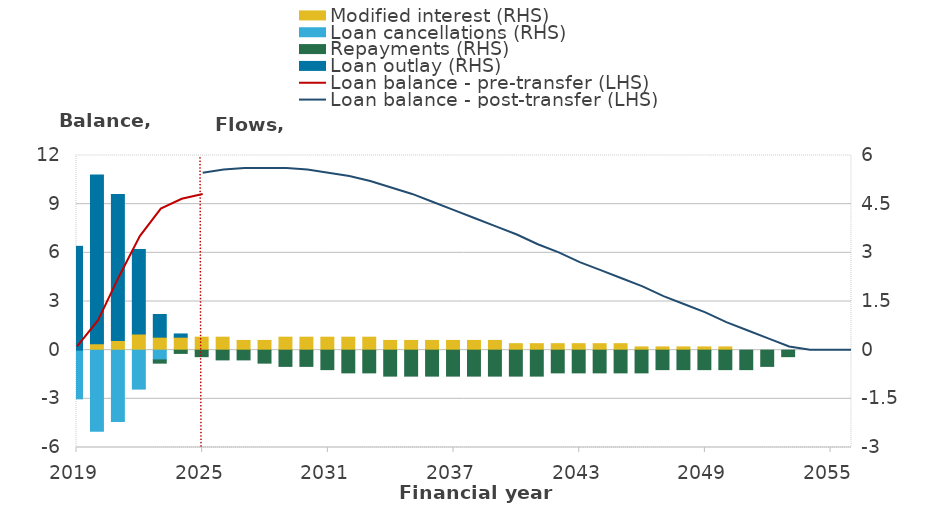
| Category | Modified interest (RHS) | Loan cancellations (RHS) | Repayments (RHS) | Loan outlay (RHS) |
|---|---|---|---|---|
| 2017-18 | 0 | -1.5 | 0 | 3.2 |
| 2018-19 | 0.2 | -2.5 | 0 | 5.2 |
| 2019-20 | 0.3 | -2.2 | 0 | 4.5 |
| 2020-21 | 0.5 | -1.2 | 0 | 2.6 |
| 2021-22 | 0.4 | -0.3 | -0.1 | 0.7 |
| 2022-23 | 0.4 | 0 | -0.1 | 0.1 |
| 2023-24 | 0.4 | 0 | -0.2 | 0 |
| 2024-25 | 0.4 | 0 | -0.3 | 0 |
| 2025-26 | 0.3 | 0 | -0.3 | 0 |
| 2026-27 | 0.3 | 0 | -0.4 | 0 |
| 2027-28 | 0.4 | 0 | -0.5 | 0 |
| 2028-29 | 0.4 | 0 | -0.5 | 0 |
| 2029-30 | 0.4 | 0 | -0.6 | 0 |
| 2030-31 | 0.4 | 0 | -0.7 | 0 |
| 2031-32 | 0.4 | 0 | -0.7 | 0 |
| 2032-33 | 0.3 | 0 | -0.8 | 0 |
| 2033-34 | 0.3 | 0 | -0.8 | 0 |
| 2034-35 | 0.3 | 0 | -0.8 | 0 |
| 2035-36 | 0.3 | 0 | -0.8 | 0 |
| 2036-37 | 0.3 | 0 | -0.8 | 0 |
| 2037-38 | 0.3 | 0 | -0.8 | 0 |
| 2038-39 | 0.2 | 0 | -0.8 | 0 |
| 2039-40 | 0.2 | 0 | -0.8 | 0 |
| 2040-41 | 0.2 | 0 | -0.7 | 0 |
| 2041-42 | 0.2 | 0 | -0.7 | 0 |
| 2042-43 | 0.2 | 0 | -0.7 | 0 |
| 2043-44 | 0.2 | 0 | -0.7 | 0 |
| 2044-45 | 0.1 | 0 | -0.7 | 0 |
| 2045-46 | 0.1 | 0 | -0.6 | 0 |
| 2046-47 | 0.1 | 0 | -0.6 | 0 |
| 2047-48 | 0.1 | 0 | -0.6 | 0 |
| 2048-49 | 0.1 | 0 | -0.6 | 0 |
| 2049-50 | 0 | 0 | -0.6 | 0 |
| 2050-51 | 0 | 0 | -0.5 | 0 |
| 2051-52 | 0 | 0 | -0.2 | 0 |
| 2052-53 | 0 | 0 | 0 | 0 |
| 2053-54 | 0 | 0 | 0 | 0 |
| 2054-55 | 0 | 0 | 0 | 0 |